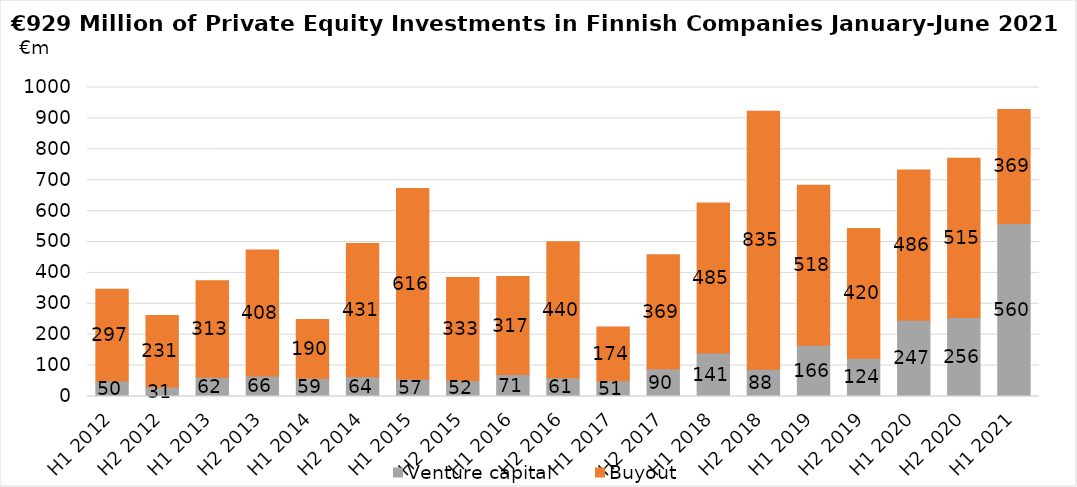
| Category | Venture capital | Buyout |
|---|---|---|
| H1 2012 | 50 | 297 |
| H2 2012 | 31 | 231 |
| H1 2013 | 62 | 313 |
| H2 2013 | 66 | 408 |
| H1 2014 | 59 | 190 |
| H2 2014 | 64 | 431 |
| H1 2015 | 57 | 616 |
| H2 2015 | 52 | 333 |
| H1 2016 | 71 | 317 |
| H2 2016 | 61 | 440 |
| H1 2017 | 51 | 174 |
| H2 2017 | 90 | 369 |
| H1 2018 | 141 | 485 |
| H2 2018 | 88 | 835 |
| H1 2019 | 166 | 518 |
| H2 2019 | 124 | 420 |
| H1 2020 | 247 | 486 |
| H2 2020 | 256 | 515 |
| H1 2021 | 560 | 369 |